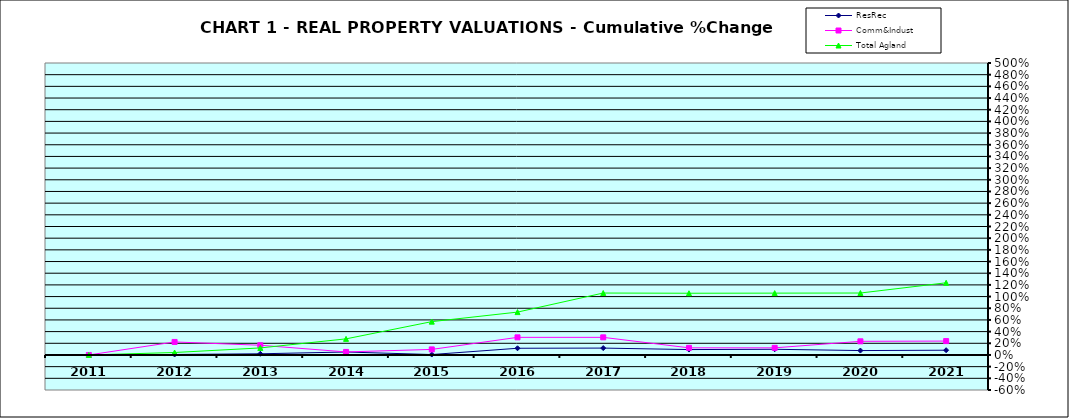
| Category | ResRec | Comm&Indust | Total Agland |
|---|---|---|---|
| 2011.0 | 0 | 0 | 0 |
| 2012.0 | 0.008 | 0.223 | 0.042 |
| 2013.0 | 0.02 | 0.166 | 0.12 |
| 2014.0 | 0.051 | 0.052 | 0.276 |
| 2015.0 | 0.007 | 0.095 | 0.571 |
| 2016.0 | 0.115 | 0.302 | 0.734 |
| 2017.0 | 0.118 | 0.302 | 1.061 |
| 2018.0 | 0.092 | 0.122 | 1.057 |
| 2019.0 | 0.097 | 0.122 | 1.059 |
| 2020.0 | 0.075 | 0.234 | 1.061 |
| 2021.0 | 0.081 | 0.238 | 1.236 |